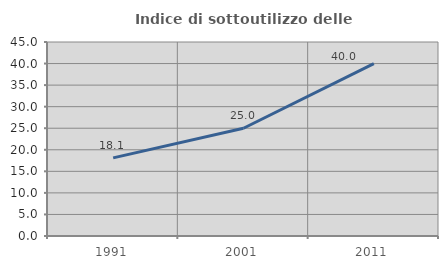
| Category | Indice di sottoutilizzo delle abitazioni  |
|---|---|
| 1991.0 | 18.119 |
| 2001.0 | 25 |
| 2011.0 | 39.978 |